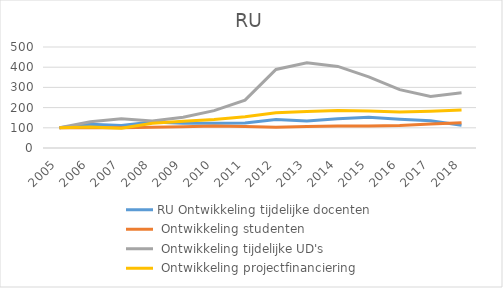
| Category | RU Ontwikkeling tijdelijke docenten | RU Ontwikkeling studenten | RU Ontwikkeling tijdelijke UD's | RU Ontwikkeling projectfinanciering |
|---|---|---|---|---|
| 2005.0 | 100 | 100 | 100 | 100 |
| 2006.0 | 117.949 | 100.023 | 129.63 | 104.142 |
| 2007.0 | 111.966 | 100.503 | 144.444 | 97.362 |
| 2008.0 | 129.06 | 102.412 | 133.333 | 122.761 |
| 2009.0 | 123.077 | 105.57 | 151.852 | 132.223 |
| 2010.0 | 122.222 | 108.48 | 185.185 | 140.979 |
| 2011.0 | 123.932 | 106.889 | 237.037 | 154.957 |
| 2012.0 | 141.026 | 103.228 | 388.889 | 174.81 |
| 2013.0 | 133.333 | 106.773 | 422.222 | 181.234 |
| 2014.0 | 144.444 | 108.329 | 403.704 | 185.609 |
| 2015.0 | 152.137 | 109.319 | 351.852 | 183.644 |
| 2016.0 | 141.88 | 111.864 | 288.889 | 178.73 |
| 2017.0 | 134.974 | 118.221 | 255.556 | 181.967 |
| 2018.0 | 112.094 | 125.376 | 273 | 187.63 |